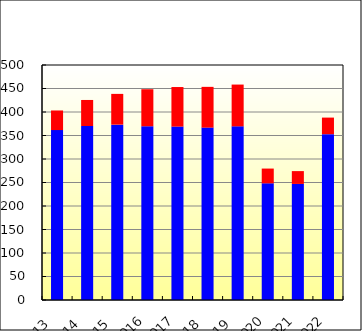
| Category | DOM | INT |
|---|---|---|
| 2013  | 361556 | 41686 |
| 2014  | 370264 | 55340 |
| 2015  | 373120 | 65422 |
| 2016 | 369704 | 78754 |
| 2017 | 368996 | 84130 |
| 2018  | 366816 | 86678 |
| 2019  | 369510 | 88858 |
| 2020 | 248236 | 31408 |
| 2021 | 246940 | 27308 |
| 2022 | 352846 | 35254 |